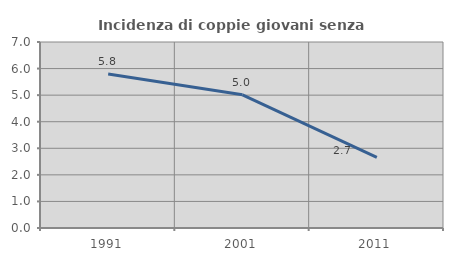
| Category | Incidenza di coppie giovani senza figli |
|---|---|
| 1991.0 | 5.794 |
| 2001.0 | 5.011 |
| 2011.0 | 2.654 |